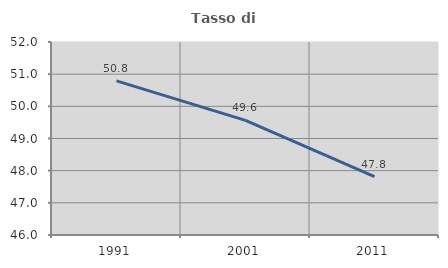
| Category | Tasso di occupazione   |
|---|---|
| 1991.0 | 50.793 |
| 2001.0 | 49.565 |
| 2011.0 | 47.814 |